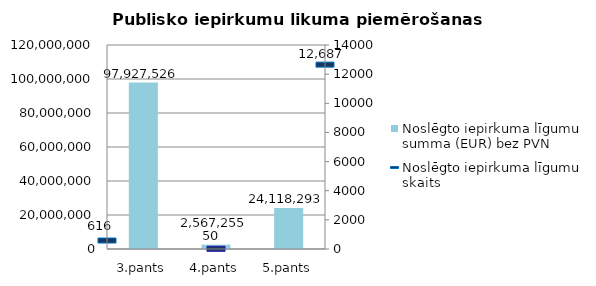
| Category | Noslēgto iepirkuma līgumu summa (EUR) bez PVN |
|---|---|
| 3.pants | 97927526 |
| 4.pants | 2567255 |
| 5.pants | 24118293 |